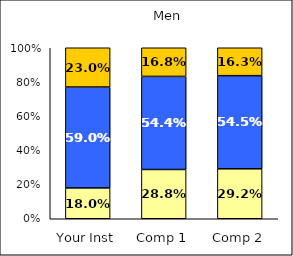
| Category | Low Civic Awareness | Average Civic Awareness | High Civic Awareness |
|---|---|---|---|
| Your Inst | 0.18 | 0.59 | 0.23 |
| Comp 1 | 0.288 | 0.544 | 0.168 |
| Comp 2 | 0.292 | 0.545 | 0.163 |